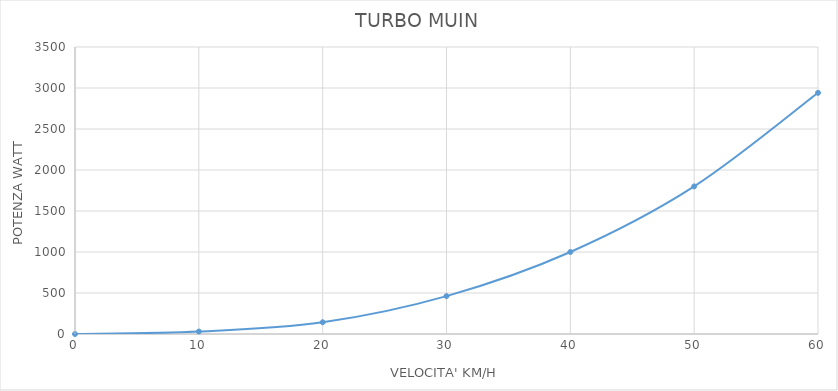
| Category | Series 0 |
|---|---|
| 0.0 | 0 |
| 10.0 | 30 |
| 20.0 | 143 |
| 30.0 | 462 |
| 40.0 | 1000 |
| 50.0 | 1800 |
| 60.0 | 2941 |